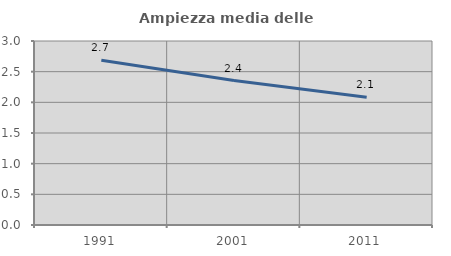
| Category | Ampiezza media delle famiglie |
|---|---|
| 1991.0 | 2.687 |
| 2001.0 | 2.355 |
| 2011.0 | 2.082 |